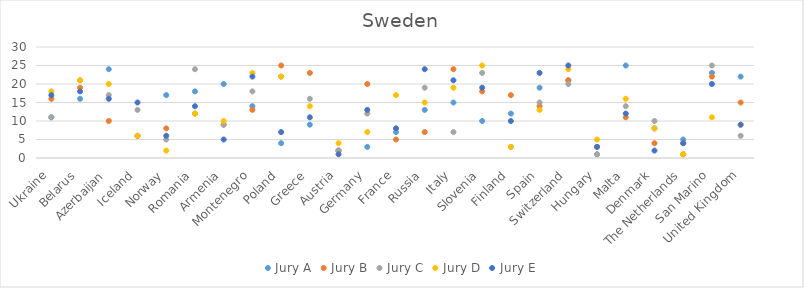
| Category | Jury A | Jury B | Jury C | Jury D | Jury E |
|---|---|---|---|---|---|
| Ukraine | 11 | 16 | 11 | 18 | 17 |
| Belarus | 16 | 19 | 21 | 21 | 18 |
| Azerbaijan | 24 | 10 | 17 | 20 | 16 |
| Iceland | 6 | 6 | 13 | 6 | 15 |
| Norway | 17 | 8 | 5 | 2 | 6 |
| Romania | 18 | 12 | 24 | 12 | 14 |
| Armenia | 20 | 9 | 9 | 10 | 5 |
| Montenegro | 14 | 13 | 18 | 23 | 22 |
| Poland | 4 | 25 | 22 | 22 | 7 |
| Greece | 9 | 23 | 16 | 14 | 11 |
| Austria | 2 | 2 | 2 | 4 | 1 |
| Germany | 3 | 20 | 12 | 7 | 13 |
| France | 7 | 5 | 8 | 17 | 8 |
| Russia | 13 | 7 | 19 | 15 | 24 |
| Italy | 15 | 24 | 7 | 19 | 21 |
| Slovenia | 10 | 18 | 23 | 25 | 19 |
| Finland | 12 | 17 | 3 | 3 | 10 |
| Spain | 19 | 14 | 15 | 13 | 23 |
| Switzerland | 21 | 21 | 20 | 24 | 25 |
| Hungary | 1 | 3 | 1 | 5 | 3 |
| Malta | 25 | 11 | 14 | 16 | 12 |
| Denmark | 8 | 4 | 10 | 8 | 2 |
| The Netherlands | 5 | 1 | 4 | 1 | 4 |
| San Marino | 23 | 22 | 25 | 11 | 20 |
| United Kingdom | 22 | 15 | 6 | 9 | 9 |